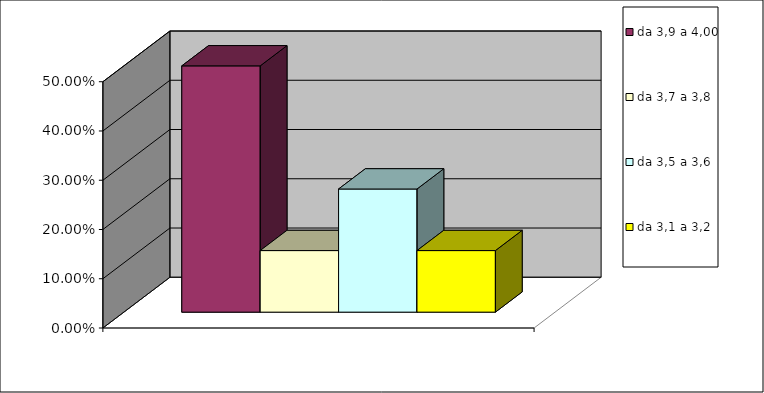
| Category | da 3,9 a 4,00 | da 3,7 a 3,8 | da 3,5 a 3,6 | da 3,3 a 3,4 | da 3,1 a 3,2 | da 2,6 a 3,0 | da 2,1 a 2,5 | da 1,6 a 2,0 | da 1,1 a 1,5 | da 0 a 1,0 |
|---|---|---|---|---|---|---|---|---|---|---|
|  | 0.5 | 0.125 |  |  |  |  |  |  |  |  |